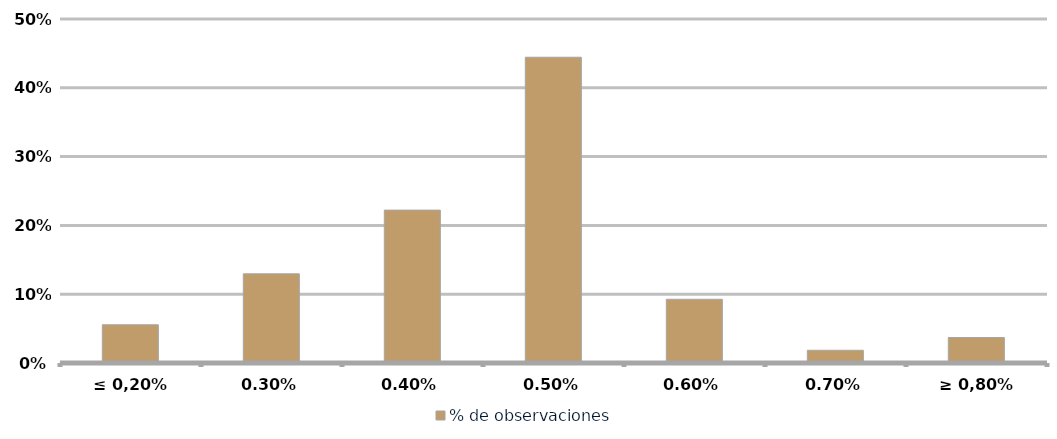
| Category | % de observaciones  |
|---|---|
| ≤ 0,20% | 0.056 |
| 0,30% | 0.13 |
| 0,40% | 0.222 |
| 0,50% | 0.444 |
| 0,60% | 0.093 |
| 0,70% | 0.019 |
| ≥ 0,80% | 0.037 |